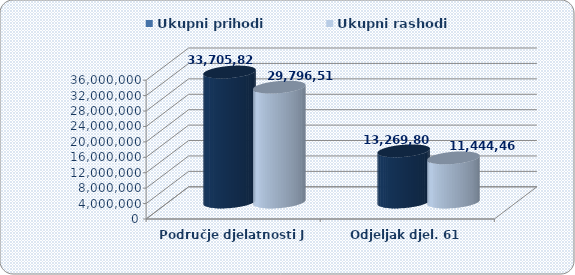
| Category | Ukupni prihodi  | Ukupni rashodi  |
|---|---|---|
| Područje djelatnosti J | 33705824.13 | 29796517.24 |
| Odjeljak djel. 61 | 13269808.123 | 11444459.907 |